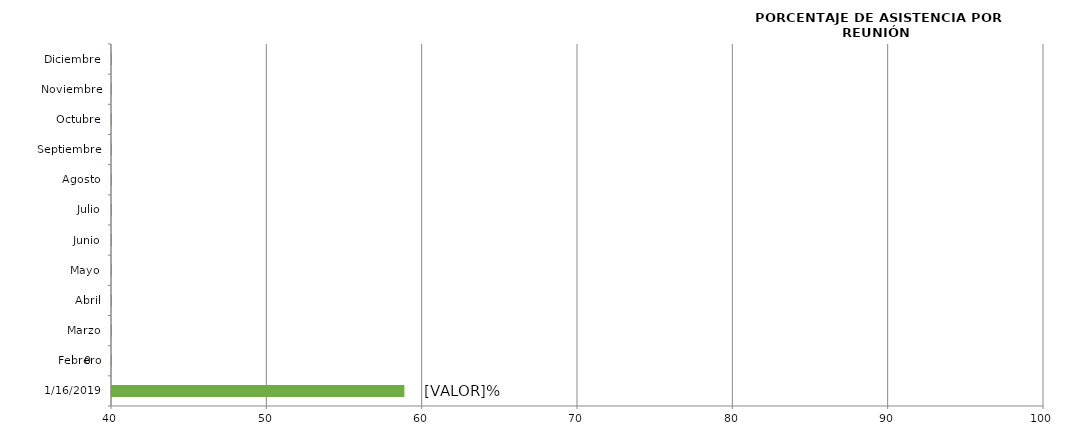
| Category | Series 0 |
|---|---|
| 16/01/2019 | 58.824 |
| Febrero | 0 |
| Marzo | 0 |
| Abril | 0 |
| Mayo | 0 |
| Junio | 0 |
| Julio | 0 |
| Agosto | 0 |
| Septiembre | 0 |
| Octubre | 0 |
| Noviembre | 0 |
| Diciembre | 0 |